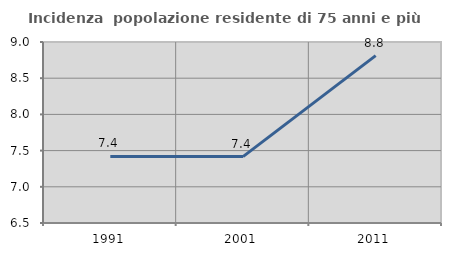
| Category | Incidenza  popolazione residente di 75 anni e più |
|---|---|
| 1991.0 | 7.419 |
| 2001.0 | 7.417 |
| 2011.0 | 8.812 |